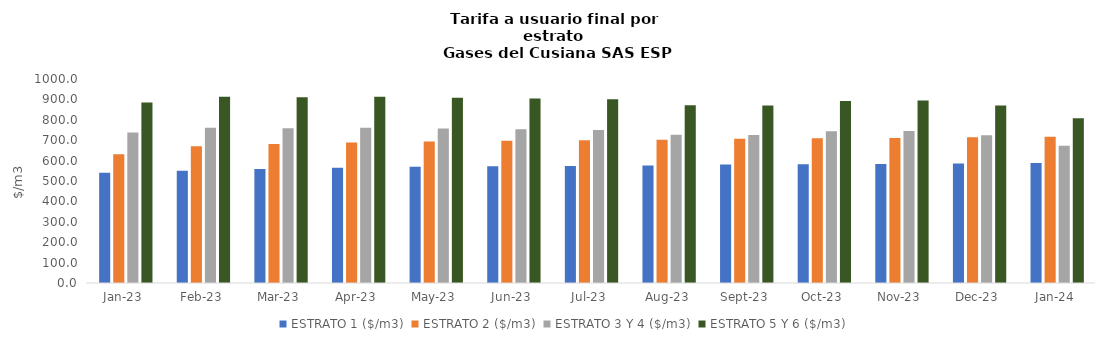
| Category | ESTRATO 1 ($/m3) | ESTRATO 2 ($/m3) | ESTRATO 3 Y 4 ($/m3) | ESTRATO 5 Y 6 ($/m3) |
|---|---|---|---|---|
| 2023-01-01 | 540.64 | 630.76 | 737.34 | 884.808 |
| 2023-02-01 | 550.34 | 670.8 | 760.69 | 912.828 |
| 2023-03-01 | 559.36 | 681.79 | 758.71 | 910.452 |
| 2023-04-01 | 565.3 | 689.03 | 760.69 | 912.828 |
| 2023-05-01 | 569.53 | 694.19 | 757.13 | 908.556 |
| 2023-06-01 | 571.88 | 697.06 | 753.75 | 904.5 |
| 2023-07-01 | 573.63 | 699.2 | 750.21 | 900.252 |
| 2023-08-01 | 576.45 | 702.64 | 726.44 | 871.728 |
| 2023-09-01 | 580.51 | 707.59 | 725.31 | 870.372 |
| 2023-10-01 | 581.75 | 709.1 | 743.81 | 892.572 |
| 2023-11-01 | 583.2 | 710.87 | 745.28 | 894.336 |
| 2023-12-01 | 585.94 | 714.2 | 724.84 | 869.808 |
| 2024-01-01 | 588.63 | 717.48 | 672.77 | 807.324 |